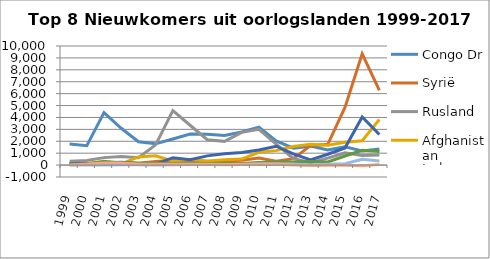
| Category | Congo Dr | Syrië | Rusland | Afghanistan | Irak | Somalië | Palestina | Israël |
|---|---|---|---|---|---|---|---|---|
| 1999.0 | 1776 | 141 | 331 | 119 | 115 | 80 | 3 | -3 |
| 2000.0 | 1623 | 108 | 394 | 129 | 140 | 63 | 12 | 97 |
| 2001.0 | 4410 | 225 | 627 | 312 | 171 | 297 | 15 | 184 |
| 2002.0 | 3090 | 189 | 715 | 91 | 232 | 198 | 34 | 171 |
| 2003.0 | 1957 | 153 | 613 | 686 | 126 | 158 | 30 | 78 |
| 2004.0 | 1797 | 303 | 1698 | 786 | 83 | 149 | 15 | 65 |
| 2005.0 | 2188 | 415 | 4573 | 338 | 621 | 132 | 31 | 61 |
| 2006.0 | 2602 | 358 | 3345 | 462 | 447 | 164 | 60 | 62 |
| 2007.0 | 2585 | 312 | 2129 | 350 | 775 | 143 | 55 | 61 |
| 2008.0 | 2478 | 333 | 1994 | 447 | 945 | 163 | 33 | 54 |
| 2009.0 | 2778 | 414 | 2749 | 509 | 1067 | 144 | 55 | 68 |
| 2010.0 | 3194 | 588 | 3010 | 1079 | 1272 | 216 | 105 | 45 |
| 2011.0 | 2025 | 321 | 1762 | 1214 | 1584 | 252 | 111 | 79 |
| 2012.0 | 1426 | 537 | 553 | 1560 | 934 | 258 | 82 | 8 |
| 2013.0 | 1591 | 1634 | 200 | 1749 | 441 | 293 | 16 | -35 |
| 2014.0 | 1269 | 1742 | 581 | 1659 | 912 | 265 | 67 | -21 |
| 2015.0 | 1545 | 4843 | 1028 | 1919 | 1438 | 764 | 109 | -14 |
| 2016.0 | 1189 | 9349 | 809 | 2044 | 4042 | 1248 | 481 | -59 |
| 2017.0 | 1355 | 6274 | 849 | 3824 | 2574 | 1138 | 339 | 46.5 |